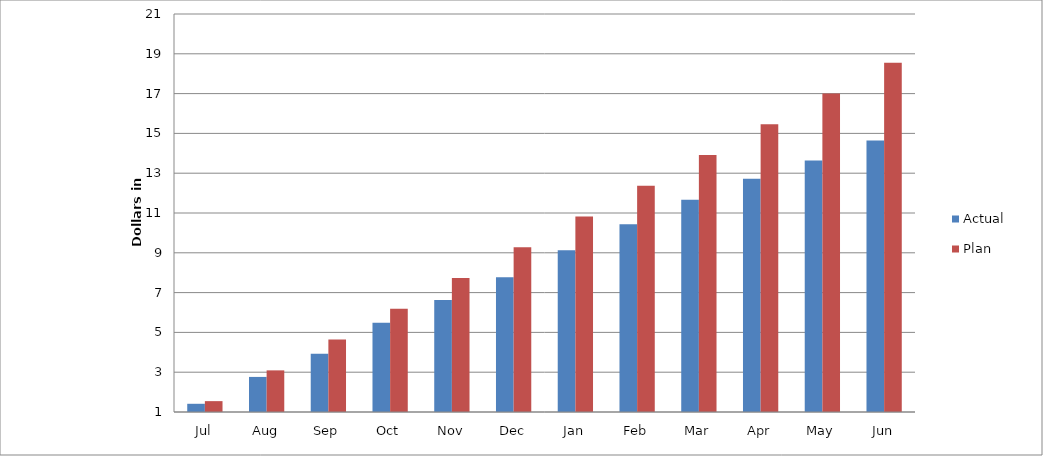
| Category | Actual | Plan |
|---|---|---|
| Jul | 1412519.45 | 1545979.5 |
| Aug | 2762887.45 | 3091959 |
| Sep | 3924133.11 | 4637938.5 |
| Oct | 5485196.11 | 6183918 |
| Nov | 6628753 | 7729897.5 |
| Dec | 7777579.51 | 9275877 |
| Jan | 9132978.48 | 10821856.5 |
| Feb | 10439226.21 | 12367836 |
| Mar | 11661925.57 | 13913815.5 |
| Apr | 12725266.49 | 15459795 |
| May | 13641567.12 | 17005774.5 |
| Jun | 14642783.92 | 18551754 |